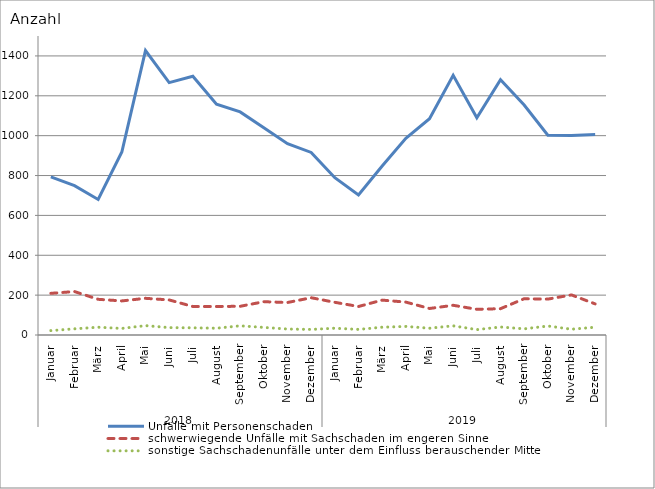
| Category | Unfälle mit Personenschaden | schwerwiegende Unfälle mit Sachschaden im engeren Sinne | sonstige Sachschadenunfälle unter dem Einfluss berauschender Mittel |
|---|---|---|---|
| 0 | 793 | 209 | 22 |
| 1 | 749 | 218 | 31 |
| 2 | 680 | 179 | 39 |
| 3 | 918 | 171 | 33 |
| 4 | 1427 | 184 | 47 |
| 5 | 1266 | 176 | 37 |
| 6 | 1298 | 143 | 36 |
| 7 | 1158 | 143 | 34 |
| 8 | 1119 | 144 | 46 |
| 9 | 1040 | 167 | 38 |
| 10 | 960 | 163 | 30 |
| 11 | 916 | 187 | 28 |
| 12 | 789 | 164 | 34 |
| 13 | 702 | 143 | 28 |
| 14 | 848 | 175 | 39 |
| 15 | 987 | 165 | 43 |
| 16 | 1085 | 133 | 34 |
| 17 | 1303 | 149 | 46 |
| 18 | 1090 | 129 | 27 |
| 19 | 1281 | 132 | 40 |
| 20 | 1154 | 182 | 31 |
| 21 | 1002 | 180 | 45 |
| 22 | 1001 | 201 | 29 |
| 23 | 1006 | 156 | 39 |